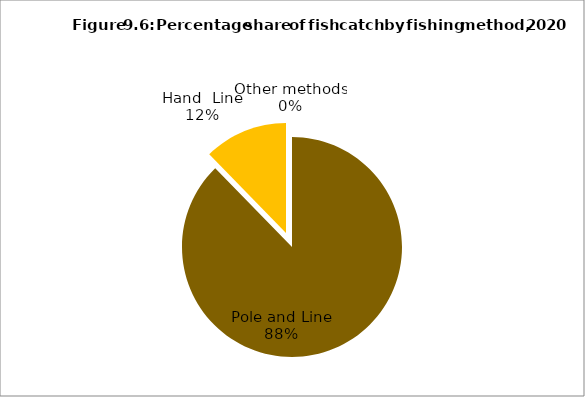
| Category | Series 0 |
|---|---|
| Pole and Line | 87.454 |
| Hand  Line | 12.258 |
| Other methods | 0 |